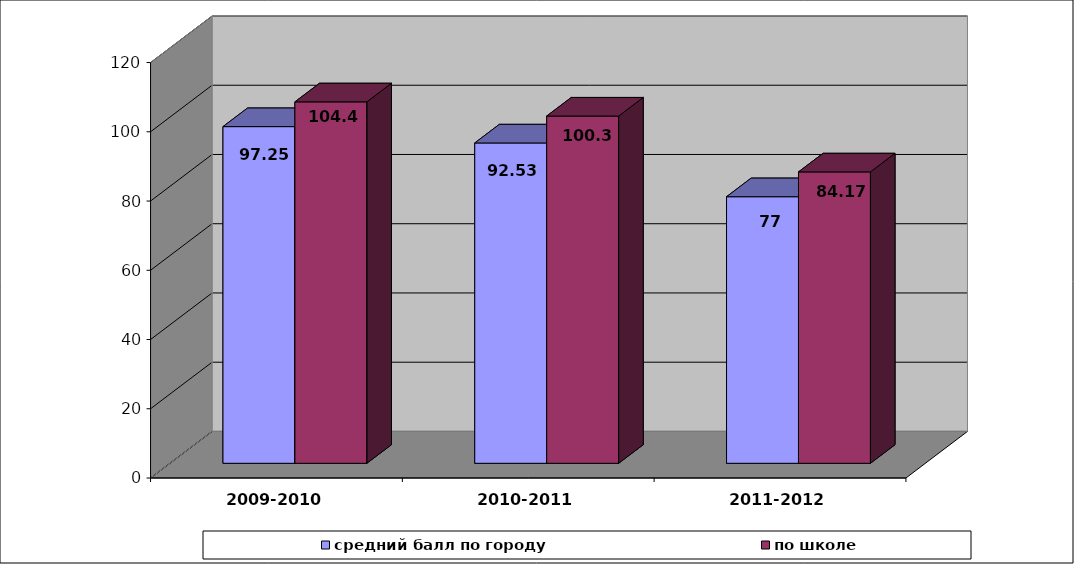
| Category | средний балл по городу | по школе |
|---|---|---|
| 2009-2010 | 97.25 | 104.4 |
| 2010-2011 | 92.53 | 100.3 |
| 2011-2012 | 77 | 84.17 |